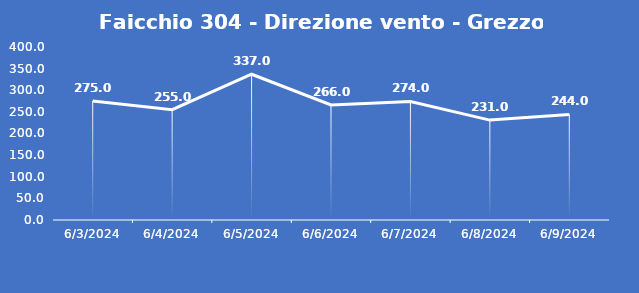
| Category | Faicchio 304 - Direzione vento - Grezzo (°N) |
|---|---|
| 6/3/24 | 275 |
| 6/4/24 | 255 |
| 6/5/24 | 337 |
| 6/6/24 | 266 |
| 6/7/24 | 274 |
| 6/8/24 | 231 |
| 6/9/24 | 244 |